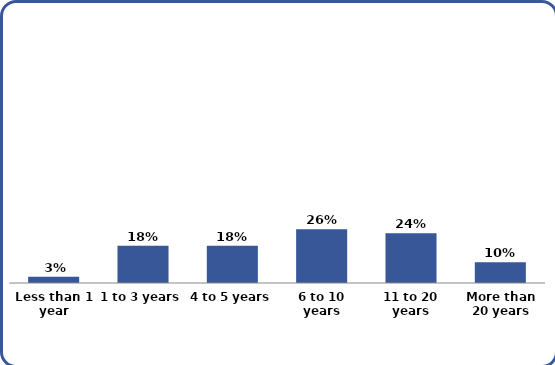
| Category | Series 0 |
|---|---|
| Less than 1 year | 0.03 |
| 1 to 3 years | 0.18 |
| 4 to 5 years | 0.18 |
| 6 to 10 years | 0.26 |
| 11 to 20 years | 0.24 |
| More than 20 years | 0.1 |